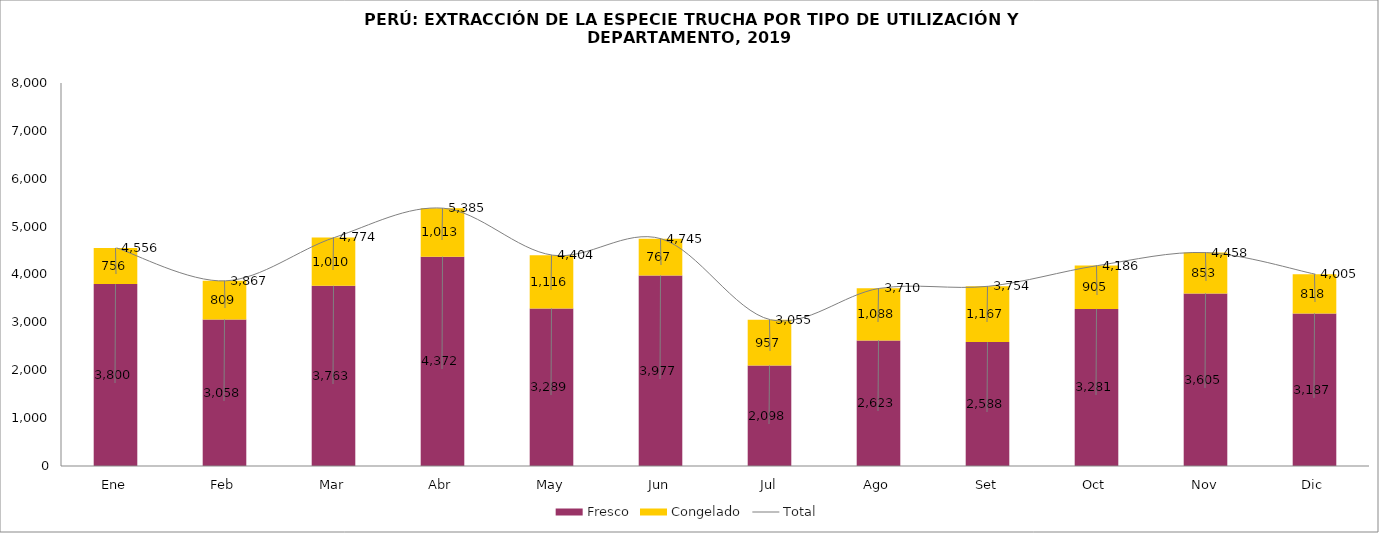
| Category | Fresco | Congelado |
|---|---|---|
| Ene | 3799.866 | 756.15 |
| Feb | 3057.742 | 809.497 |
| Mar | 3763.389 | 1010.361 |
| Abr | 4371.625 | 1012.962 |
| May | 3288.667 | 1115.602 |
| Jun | 3977.406 | 767.178 |
| Jul | 2098.001 | 957.272 |
| Ago | 2622.792 | 1087.701 |
| Set | 2587.683 | 1166.795 |
| Oct | 3281.189 | 905.119 |
| Nov | 3604.699 | 852.825 |
| Dic | 3187.131 | 818.242 |